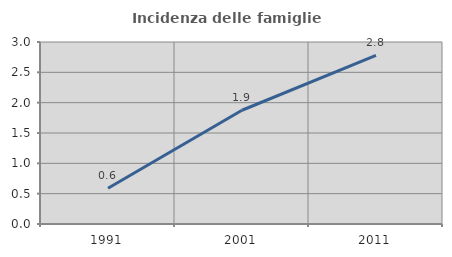
| Category | Incidenza delle famiglie numerose |
|---|---|
| 1991.0 | 0.588 |
| 2001.0 | 1.875 |
| 2011.0 | 2.778 |